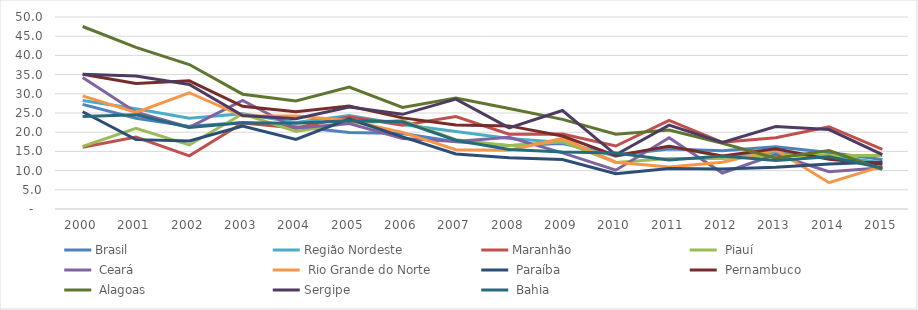
| Category | Brasil | Região Nordeste | Maranhão |  Piauí |  Ceará |  Rio Grande do Norte |  Paraíba |  Pernambuco |  Alagoas | Sergipe |  Bahia |
|---|---|---|---|---|---|---|---|---|---|---|---|
| 2000.0 | 27.255 | 28.237 | 16.068 | 16.321 | 34.259 | 29.464 | 25.314 | 35.104 | 47.521 | 35.098 | 24.059 |
| 2001.0 | 23.619 | 26.096 | 18.726 | 21.023 | 25.214 | 25.139 | 18.066 | 32.681 | 42.092 | 34.605 | 24.512 |
| 2002.0 | 21.52 | 23.666 | 13.852 | 16.678 | 21.28 | 30.274 | 17.698 | 33.384 | 37.62 | 32.423 | 21.204 |
| 2003.0 | 22.494 | 24.786 | 22.416 | 24.789 | 28.265 | 24.192 | 21.592 | 26.747 | 29.901 | 24.359 | 22.436 |
| 2004.0 | 21.411 | 22.555 | 21.086 | 20.214 | 21.018 | 24.213 | 18.117 | 25.326 | 28.121 | 23.491 | 22.329 |
| 2005.0 | 19.911 | 24.344 | 24.045 | 22.362 | 22.275 | 23.026 | 23.448 | 26.808 | 31.765 | 26.539 | 22.955 |
| 2006.0 | 19.643 | 22.004 | 21.79 | 23.065 | 18.372 | 19.965 | 18.772 | 23.729 | 26.458 | 24.656 | 22.727 |
| 2007.0 | 17.49 | 20.17 | 24.062 | 18.043 | 17.585 | 15.444 | 14.339 | 21.906 | 28.927 | 28.605 | 17.91 |
| 2008.0 | 16.556 | 18.365 | 19.469 | 16.466 | 18.685 | 15.32 | 13.323 | 21.64 | 26.174 | 21.131 | 15.499 |
| 2009.0 | 17.028 | 17.354 | 19.521 | 17.54 | 14.604 | 18.375 | 12.89 | 19.001 | 23.348 | 25.653 | 14.815 |
| 2010.0 | 14.086 | 13.72 | 16.405 | 12.114 | 10.095 | 12.194 | 9.197 | 13.859 | 19.496 | 14.117 | 14.589 |
| 2011.0 | 15.621 | 16.364 | 23.075 | 13.157 | 18.534 | 10.92 | 10.53 | 16.303 | 20.548 | 21.831 | 12.745 |
| 2012.0 | 15.146 | 13.659 | 17.373 | 13.17 | 9.365 | 12.192 | 10.387 | 13.83 | 17.129 | 17.336 | 13.794 |
| 2013.0 | 16.228 | 14.725 | 18.569 | 13.933 | 14.154 | 15.373 | 10.87 | 15.689 | 13.22 | 21.475 | 12.622 |
| 2014.0 | 14.721 | 13.962 | 21.425 | 13.954 | 9.688 | 6.846 | 11.693 | 12.966 | 15.206 | 20.682 | 13.617 |
| 2015.0 | 12.912 | 11.99 | 15.535 | 13.943 | 10.712 | 11.182 | 12.221 | 11.661 | 10.358 | 14.166 | 10.656 |